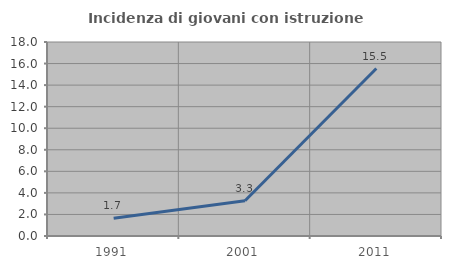
| Category | Incidenza di giovani con istruzione universitaria |
|---|---|
| 1991.0 | 1.653 |
| 2001.0 | 3.268 |
| 2011.0 | 15.541 |